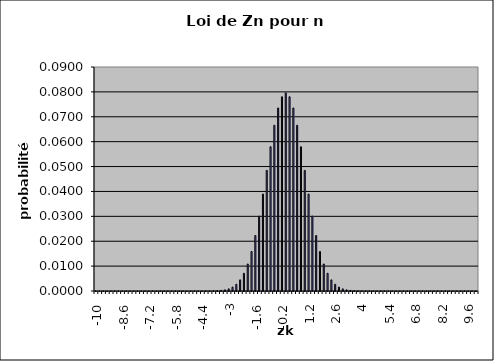
| Category | Series 0 |
|---|---|
| -10.0 | 0 |
| -9.8 | 0 |
| -9.6 | 0 |
| -9.4 | 0 |
| -9.2 | 0 |
| -9.0 | 0 |
| -8.8 | 0 |
| -8.6 | 0 |
| -8.4 | 0 |
| -8.2 | 0 |
| -8.0 | 0 |
| -7.8 | 0 |
| -7.6 | 0 |
| -7.4 | 0 |
| -7.2 | 0 |
| -7.0 | 0 |
| -6.8 | 0 |
| -6.6 | 0 |
| -6.4 | 0 |
| -6.2 | 0 |
| -6.0 | 0 |
| -5.8 | 0 |
| -5.6 | 0 |
| -5.4 | 0 |
| -5.2 | 0 |
| -5.0 | 0 |
| -4.8 | 0 |
| -4.6 | 0 |
| -4.4 | 0 |
| -4.2 | 0 |
| -4.0 | 0 |
| -3.8 | 0 |
| -3.6 | 0 |
| -3.4 | 0 |
| -3.2 | 0 |
| -3.0 | 0.001 |
| -2.8 | 0.002 |
| -2.6 | 0.003 |
| -2.4 | 0.004 |
| -2.2 | 0.007 |
| -2.0 | 0.011 |
| -1.8 | 0.016 |
| -1.6 | 0.022 |
| -1.4 | 0.03 |
| -1.2 | 0.039 |
| -1.0 | 0.048 |
| -0.8 | 0.058 |
| -0.6 | 0.067 |
| -0.4 | 0.074 |
| -0.2 | 0.078 |
| 0.0 | 0.08 |
| 0.2 | 0.078 |
| 0.4 | 0.074 |
| 0.6 | 0.067 |
| 0.8 | 0.058 |
| 1.0 | 0.048 |
| 1.2 | 0.039 |
| 1.4 | 0.03 |
| 1.6 | 0.022 |
| 1.8 | 0.016 |
| 2.0 | 0.011 |
| 2.2 | 0.007 |
| 2.4 | 0.004 |
| 2.6 | 0.003 |
| 2.8 | 0.002 |
| 3.0 | 0.001 |
| 3.2 | 0 |
| 3.4 | 0 |
| 3.6 | 0 |
| 3.8 | 0 |
| 4.0 | 0 |
| 4.2 | 0 |
| 4.4 | 0 |
| 4.6 | 0 |
| 4.8 | 0 |
| 5.0 | 0 |
| 5.2 | 0 |
| 5.4 | 0 |
| 5.6 | 0 |
| 5.8 | 0 |
| 6.0 | 0 |
| 6.2 | 0 |
| 6.4 | 0 |
| 6.6 | 0 |
| 6.8 | 0 |
| 7.0 | 0 |
| 7.2 | 0 |
| 7.4 | 0 |
| 7.6 | 0 |
| 7.8 | 0 |
| 8.0 | 0 |
| 8.2 | 0 |
| 8.4 | 0 |
| 8.6 | 0 |
| 8.8 | 0 |
| 9.0 | 0 |
| 9.2 | 0 |
| 9.4 | 0 |
| 9.6 | 0 |
| 9.8 | 0 |
| 10.0 | 0 |